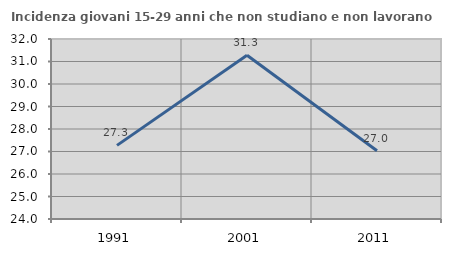
| Category | Incidenza giovani 15-29 anni che non studiano e non lavorano  |
|---|---|
| 1991.0 | 27.273 |
| 2001.0 | 31.277 |
| 2011.0 | 27.031 |